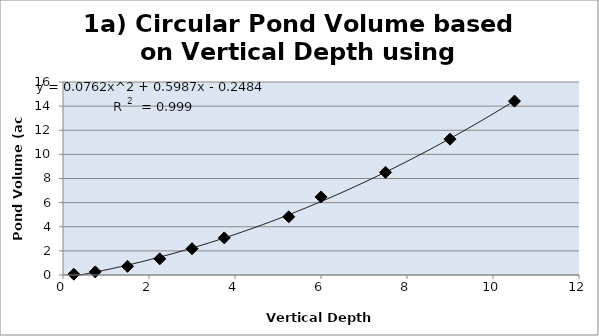
| Category | Series 0 |
|---|---|
| 0.25 | 0.064 |
| 0.75 | 0.257 |
| 1.5 | 0.719 |
| 2.25 | 1.342 |
| 3.0 | 2.179 |
| 3.75 | 3.074 |
| 5.25 | 4.826 |
| 6.0 | 6.472 |
| 7.5 | 8.511 |
| 9.0 | 11.26 |
| 10.5 | 14.417 |
| nan | 0 |